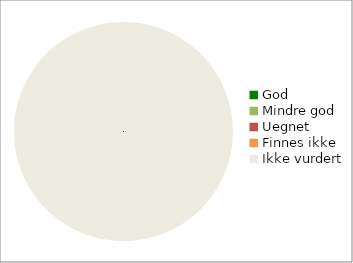
| Category | Series 0 |
|---|---|
| God | 0 |
| Mindre god | 0 |
| Uegnet | 0 |
| Finnes ikke | 0 |
| Ikke vurdert | 152 |